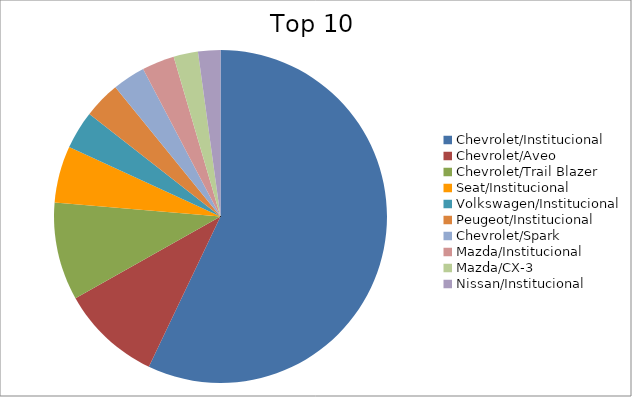
| Category | Series 0 |
|---|---|
| Chevrolet/Institucional | 47.41 |
| Chevrolet/Aveo | 8.1 |
| Chevrolet/Trail Blazer | 7.89 |
| Seat/Institucional | 4.58 |
| Volkswagen/Institucional | 3.09 |
| Peugeot/Institucional | 2.96 |
| Chevrolet/Spark | 2.64 |
| Mazda/Institucional | 2.62 |
| Mazda/CX-3 | 1.97 |
| Nissan/Institucional | 1.8 |